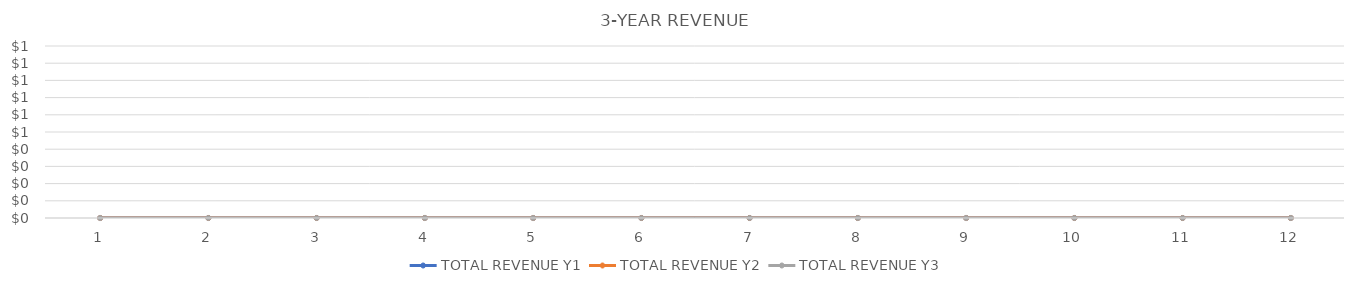
| Category | TOTAL REVENUE Y1 | TOTAL REVENUE Y2 | TOTAL REVENUE Y3 |
|---|---|---|---|
| 0 | 0 | 0 | 0 |
| 1 | 0 | 0 | 0 |
| 2 | 0 | 0 | 0 |
| 3 | 0 | 0 | 0 |
| 4 | 0 | 0 | 0 |
| 5 | 0 | 0 | 0 |
| 6 | 0 | 0 | 0 |
| 7 | 0 | 0 | 0 |
| 8 | 0 | 0 | 0 |
| 9 | 0 | 0 | 0 |
| 10 | 0 | 0 | 0 |
| 11 | 0 | 0 | 0 |